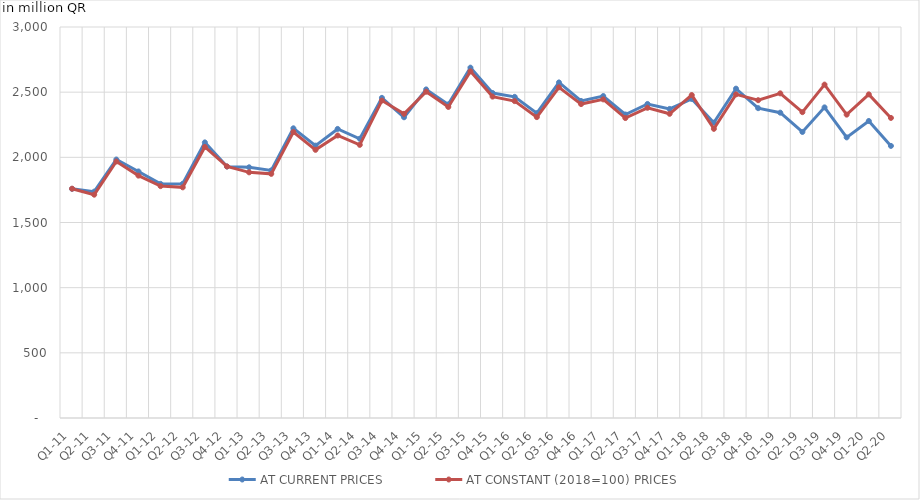
| Category | AT CURRENT PRICES | AT CONSTANT (2018=100) PRICES |
|---|---|---|
| Q1-11 | 1758.205 | 1759.299 |
| Q2-11 | 1736.89 | 1713.496 |
| Q3-11 | 1983.161 | 1968.001 |
| Q4-11 | 1891.683 | 1859.583 |
| Q1-12 | 1796.27 | 1779.171 |
| Q2-12 | 1797.07 | 1769.779 |
| Q3-12 | 2114.541 | 2079.496 |
| Q4-12 | 1929.13 | 1930.279 |
| Q1-13 | 1923.483 | 1884.884 |
| Q2-13 | 1899.765 | 1873.149 |
| Q3-13 | 2222.638 | 2194.369 |
| Q4-13 | 2089.794 | 2057.639 |
| Q1-14 | 2217.932 | 2167.665 |
| Q2-14 | 2142.352 | 2095.719 |
| Q3-14 | 2456.313 | 2435.592 |
| Q4-14 | 2307.383 | 2333.777 |
| Q1-15 | 2521.04 | 2503.451 |
| Q2-15 | 2406.308 | 2386.535 |
| Q3-15 | 2688.088 | 2659.67 |
| Q4-15 | 2493.641 | 2466.024 |
| Q1-16 | 2464.01 | 2431.267 |
| Q2-16 | 2338.667 | 2308.636 |
| Q3-16 | 2574.685 | 2537.111 |
| Q4-16 | 2432.311 | 2408.622 |
| Q1-17 | 2470.219 | 2444.683 |
| Q2-17 | 2328.562 | 2301.441 |
| Q3-17 | 2409.535 | 2380.278 |
| Q4-17 | 2371.215 | 2334.087 |
| Q1-18 | 2447.96 | 2477.841 |
| Q2-18 | 2265.83 | 2218.627 |
| Q3-18 | 2526.941 | 2483.036 |
| Q4-18 | 2377.223 | 2438.451 |
| Q1-19 | 2342.658 | 2490.899 |
| Q2-19 | 2194.75 | 2346.707 |
| Q3-19 | 2383.377 | 2558.024 |
| Q4-19 | 2153.077 | 2327.661 |
| Q1-20 | 2278.872 | 2483.124 |
| Q2-20 | 2087.698 | 2302.407 |